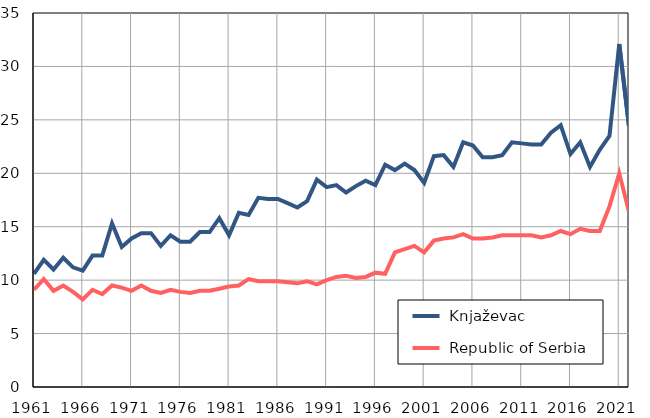
| Category |  Knjaževac |  Republic of Serbia |
|---|---|---|
| 1961.0 | 10.6 | 9.1 |
| 1962.0 | 11.9 | 10.1 |
| 1963.0 | 11 | 9 |
| 1964.0 | 12.1 | 9.5 |
| 1965.0 | 11.2 | 8.9 |
| 1966.0 | 10.9 | 8.2 |
| 1967.0 | 12.3 | 9.1 |
| 1968.0 | 12.3 | 8.7 |
| 1969.0 | 15.3 | 9.5 |
| 1970.0 | 13.1 | 9.3 |
| 1971.0 | 13.9 | 9 |
| 1972.0 | 14.4 | 9.5 |
| 1973.0 | 14.4 | 9 |
| 1974.0 | 13.2 | 8.8 |
| 1975.0 | 14.2 | 9.1 |
| 1976.0 | 13.6 | 8.9 |
| 1977.0 | 13.6 | 8.8 |
| 1978.0 | 14.5 | 9 |
| 1979.0 | 14.5 | 9 |
| 1980.0 | 15.8 | 9.2 |
| 1981.0 | 14.2 | 9.4 |
| 1982.0 | 16.3 | 9.5 |
| 1983.0 | 16.1 | 10.1 |
| 1984.0 | 17.7 | 9.9 |
| 1985.0 | 17.6 | 9.9 |
| 1986.0 | 17.6 | 9.9 |
| 1987.0 | 17.2 | 9.8 |
| 1988.0 | 16.8 | 9.7 |
| 1989.0 | 17.4 | 9.9 |
| 1990.0 | 19.4 | 9.6 |
| 1991.0 | 18.7 | 10 |
| 1992.0 | 18.9 | 10.3 |
| 1993.0 | 18.2 | 10.4 |
| 1994.0 | 18.8 | 10.2 |
| 1995.0 | 19.3 | 10.3 |
| 1996.0 | 18.9 | 10.7 |
| 1997.0 | 20.8 | 10.6 |
| 1998.0 | 20.3 | 12.6 |
| 1999.0 | 20.9 | 12.9 |
| 2000.0 | 20.3 | 13.2 |
| 2001.0 | 19.1 | 12.6 |
| 2002.0 | 21.6 | 13.7 |
| 2003.0 | 21.7 | 13.9 |
| 2004.0 | 20.6 | 14 |
| 2005.0 | 22.9 | 14.3 |
| 2006.0 | 22.6 | 13.9 |
| 2007.0 | 21.5 | 13.9 |
| 2008.0 | 21.5 | 14 |
| 2009.0 | 21.7 | 14.2 |
| 2010.0 | 22.9 | 14.2 |
| 2011.0 | 22.8 | 14.2 |
| 2012.0 | 22.7 | 14.2 |
| 2013.0 | 22.7 | 14 |
| 2014.0 | 23.8 | 14.2 |
| 2015.0 | 24.5 | 14.6 |
| 2016.0 | 21.8 | 14.3 |
| 2017.0 | 22.9 | 14.8 |
| 2018.0 | 20.6 | 14.6 |
| 2019.0 | 22.2 | 14.6 |
| 2020.0 | 23.5 | 16.9 |
| 2021.0 | 32.1 | 20 |
| 2022.0 | 24.4 | 16.4 |